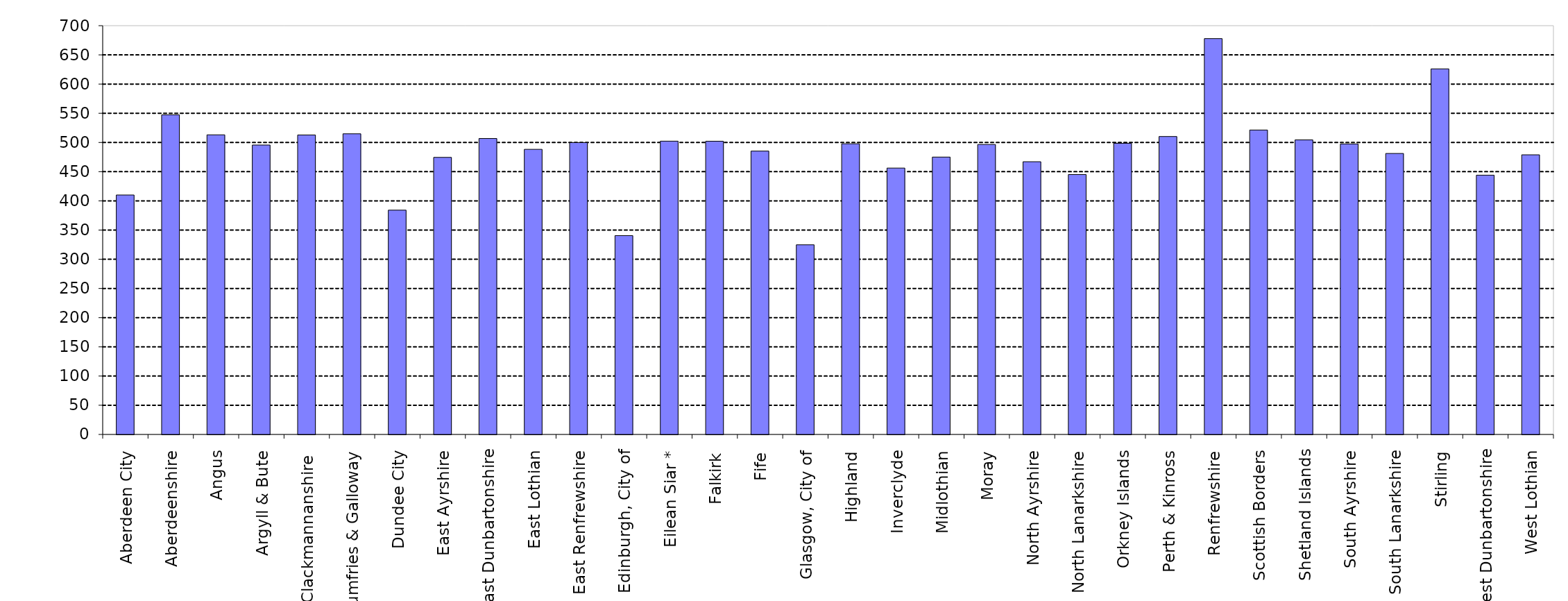
| Category | Series 0 |
|---|---|
| Aberdeen City | 410.043 |
| Aberdeenshire | 547.375 |
| Angus | 513.081 |
| Argyll & Bute | 495.616 |
| Clackmannanshire  | 512.844 |
| Dumfries & Galloway | 514.873 |
| Dundee City | 384.112 |
| East Ayrshire | 474.488 |
| East Dunbartonshire | 506.804 |
| East Lothian | 488.255 |
| East Renfrewshire | 499.886 |
| Edinburgh, City of | 340.532 |
| Eilean Siar * | 502.252 |
| Falkirk | 502.159 |
| Fife | 485.253 |
| Glasgow, City of | 324.751 |
| Highland | 497.765 |
| Inverclyde | 456.167 |
| Midlothian | 475 |
| Moray | 496.587 |
| North Ayrshire | 467.039 |
| North Lanarkshire | 445.079 |
| Orkney Islands | 498.625 |
| Perth & Kinross | 510.207 |
| Renfrewshire | 677.865 |
| Scottish Borders | 521.341 |
| Shetland Islands | 504.403 |
| South Ayrshire | 497.448 |
| South Lanarkshire | 481.189 |
| Stirling | 626.04 |
| West Dunbartonshire | 444.014 |
| West Lothian | 478.882 |